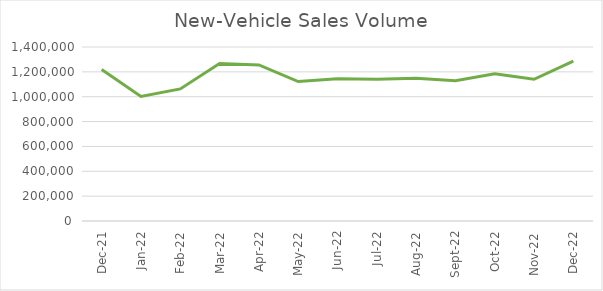
| Category | Series 0 |
|---|---|
| 2021-12-01 | 1218622 |
| 2022-01-01 | 1002739 |
| 2022-02-01 | 1062812 |
| 2022-03-01 | 1267623 |
| 2022-04-01 | 1255970 |
| 2022-05-01 | 1121835 |
| 2022-06-01 | 1144405 |
| 2022-07-01 | 1140528 |
| 2022-08-01 | 1148948 |
| 2022-09-01 | 1129298 |
| 2022-10-01 | 1185463 |
| 2022-11-01 | 1140431 |
| 2022-12-01 | 1285553 |